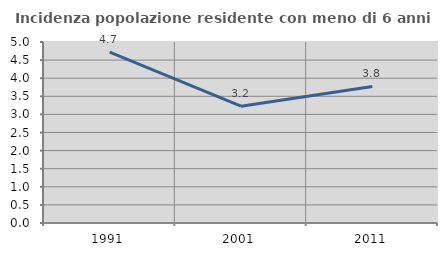
| Category | Incidenza popolazione residente con meno di 6 anni |
|---|---|
| 1991.0 | 4.721 |
| 2001.0 | 3.226 |
| 2011.0 | 3.774 |